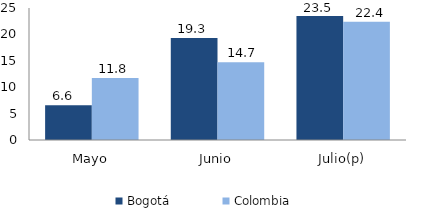
| Category | Bogotá | Colombia |
|---|---|---|
| Mayo | 6.605 | 11.763 |
| Junio | 19.325 | 14.724 |
| Julio(p) | 23.464 | 22.385 |